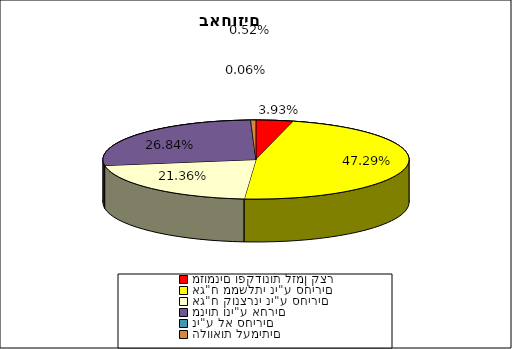
| Category | Series 0 |
|---|---|
| מזומנים ופקדונות לזמן קצר | 0.039 |
| אג"ח ממשלתי ני"ע סחירים | 0.473 |
| אג"ח קונצרני ני"ע סחירים | 0.214 |
| מניות וני"ע אחרים | 0.268 |
| ני"ע לא סחירים | 0.001 |
| הלוואות לעמיתים | 0.005 |